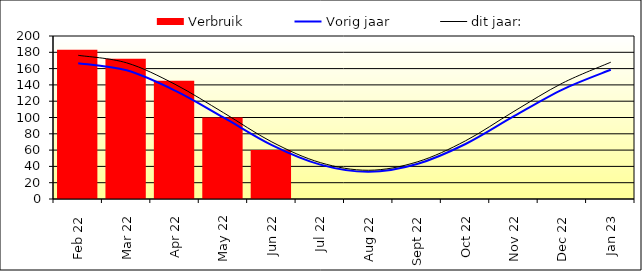
| Category | Verbruik |
|---|---|
| 2022-02-01 | 183 |
| 2022-03-01 | 172 |
| 2022-04-01 | 145 |
| 2022-05-01 | 100 |
| 2022-06-01 | 60 |
| 2022-07-01 | 0 |
| 2022-08-01 | 0 |
| 2022-09-01 | 0 |
| 2022-10-01 | 0 |
| 2022-11-01 | 0 |
| 2022-12-01 | 0 |
| 2023-01-01 | 0 |